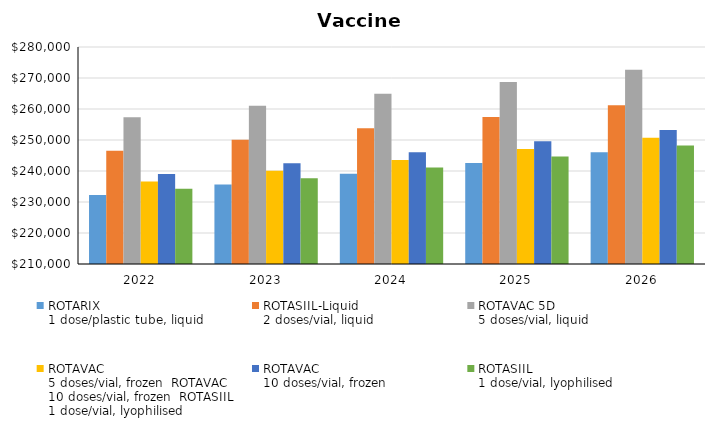
| Category | ROTARIX
1 dose/plastic tube, liquid | ROTASIIL-Liquid
2 doses/vial, liquid | ROTAVAC 5D
5 doses/vial, liquid | ROTAVAC
5 doses/vial, frozen ROTAVAC 
10 doses/vial, frozen ROTASIIL
1 dose/vial, lyophilised | ROTAVAC 
10 doses/vial, frozen | ROTASIIL
1 dose/vial, lyophilised |
|---|---|---|---|---|---|---|
| 2022.0 | 232283.333 | 246536.923 | 257345.057 | 236638.947 | 239034.468 | 234293.333 |
| 2023.0 | 235659.967 | 250120.757 | 261086.007 | 240078.898 | 242509.241 | 237699.186 |
| 2024.0 | 239085.687 | 253756.689 | 264881.337 | 243568.854 | 246034.527 | 241154.549 |
| 2025.0 | 242561.205 | 257445.475 | 268731.838 | 247109.542 | 249611.058 | 244660.141 |
| 2026.0 | 246087.245 | 261187.884 | 272638.314 | 250701.701 | 253239.58 | 248216.694 |